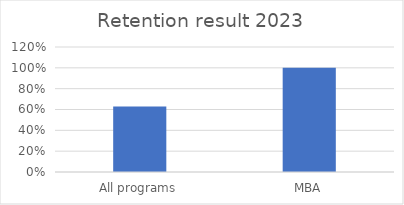
| Category | Result 2023 |
|---|---|
| All programs | 0.63 |
| MBA | 1 |